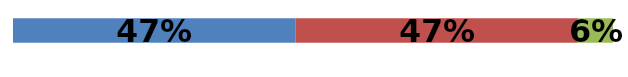
| Category | Series 0 | Series 1 | Series 2 |
|---|---|---|---|
| 0 | 0.471 | 0.471 | 0.059 |